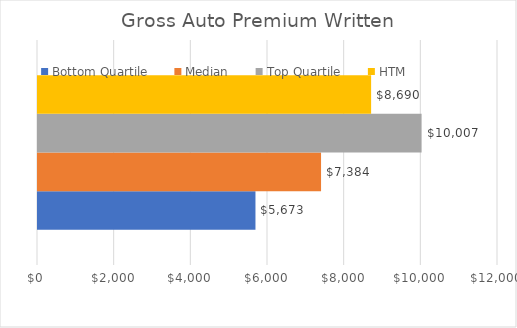
| Category | Bottom Quartile | Median | Top Quartile | HTM  |
|---|---|---|---|---|
| 0 | 5673 | 7384 | 10006.6 | 8690 |